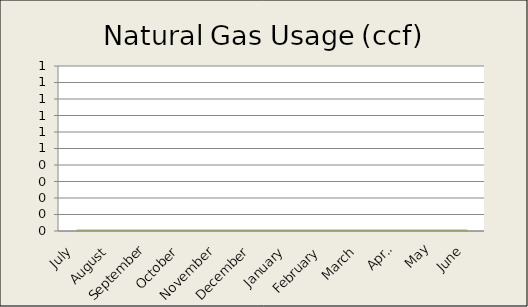
| Category | Natural Gas (ccf) |
|---|---|
| 0 | 0 |
| 1 | 0 |
| 2 | 0 |
| 3 | 0 |
| 4 | 0 |
| 5 | 0 |
| 6 | 0 |
| 7 | 0 |
| 8 | 0 |
| 9 | 0 |
| 10 | 0 |
| 11 | 0 |